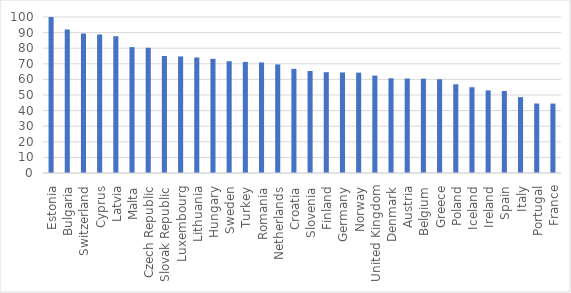
| Category | Series 0 |
|---|---|
| Estonia | 100 |
| Bulgaria | 92.006 |
| Switzerland | 89.405 |
| Cyprus | 88.759 |
| Latvia | 87.709 |
| Malta | 80.707 |
| Czech Republic | 80.302 |
| Slovak Republic | 74.987 |
| Luxembourg | 74.73 |
| Lithuania | 74.045 |
| Hungary | 73.208 |
| Sweden | 71.643 |
| Turkey | 71.21 |
| Romania | 70.862 |
| Netherlands | 69.597 |
| Croatia | 66.754 |
| Slovenia | 65.391 |
| Finland | 64.617 |
| Germany | 64.454 |
| Norway | 64.324 |
| United Kingdom | 62.428 |
| Denmark | 60.698 |
| Austria | 60.548 |
| Belgium | 60.458 |
| Greece | 60.114 |
| Poland | 56.898 |
| Iceland | 54.993 |
| Ireland | 52.926 |
| Spain | 52.583 |
| Italy | 48.634 |
| Portugal | 44.537 |
| France | 44.498 |